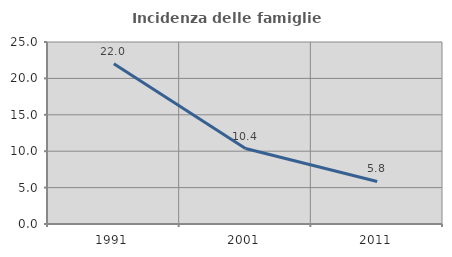
| Category | Incidenza delle famiglie numerose |
|---|---|
| 1991.0 | 21.998 |
| 2001.0 | 10.37 |
| 2011.0 | 5.841 |